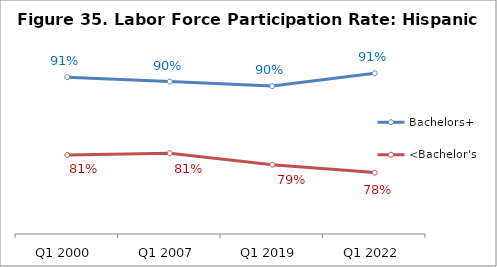
| Category | Bachelors+ | <Bachelor's |
|---|---|---|
| Q1 2000 | 0.91 | 0.806 |
| Q1 2007 | 0.904 | 0.808 |
| Q1 2019 | 0.898 | 0.793 |
| Q1 2022 | 0.915 | 0.782 |